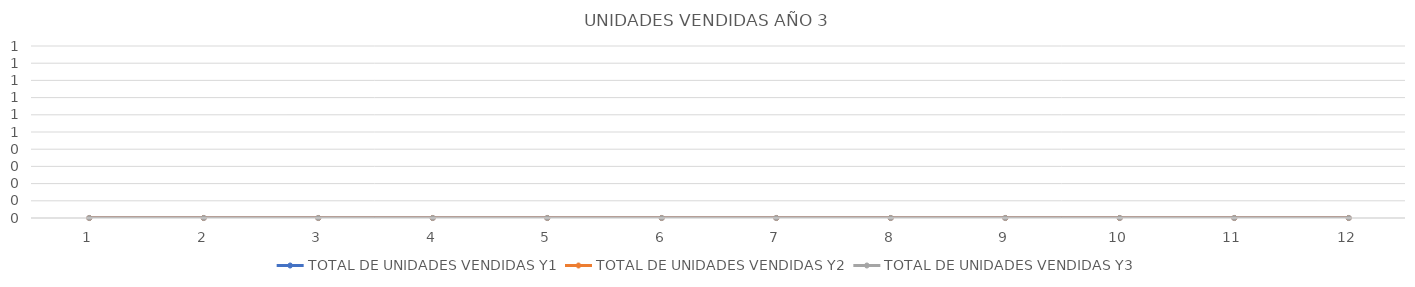
| Category | TOTAL DE UNIDADES VENDIDAS Y1 | TOTAL DE UNIDADES VENDIDAS Y2 | TOTAL DE UNIDADES VENDIDAS Y3 |
|---|---|---|---|
| 0 | 0 | 0 | 0 |
| 1 | 0 | 0 | 0 |
| 2 | 0 | 0 | 0 |
| 3 | 0 | 0 | 0 |
| 4 | 0 | 0 | 0 |
| 5 | 0 | 0 | 0 |
| 6 | 0 | 0 | 0 |
| 7 | 0 | 0 | 0 |
| 8 | 0 | 0 | 0 |
| 9 | 0 | 0 | 0 |
| 10 | 0 | 0 | 0 |
| 11 | 0 | 0 | 0 |